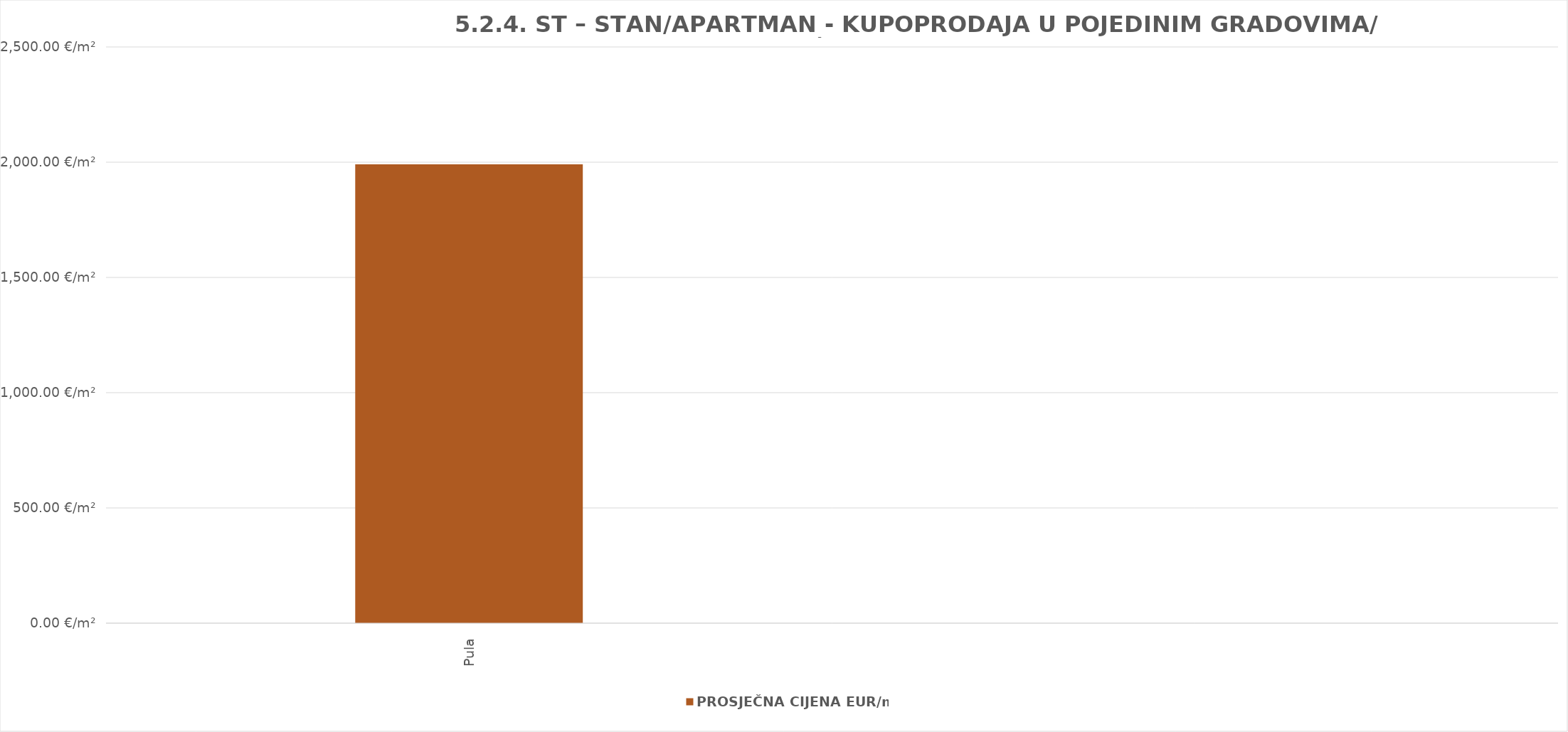
| Category | PROSJEČNA CIJENA EUR/m² |
|---|---|
| Pula | 1905-06-12 22:14:53 |